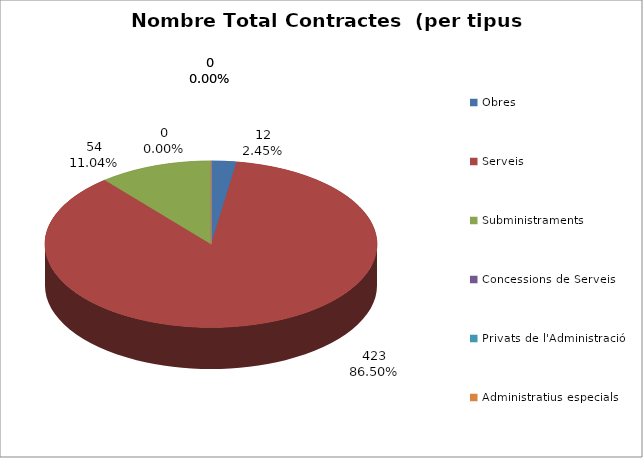
| Category | Nombre Total Contractes |
|---|---|
| Obres | 12 |
| Serveis | 423 |
| Subministraments | 54 |
| Concessions de Serveis | 0 |
| Privats de l'Administració | 0 |
| Administratius especials | 0 |